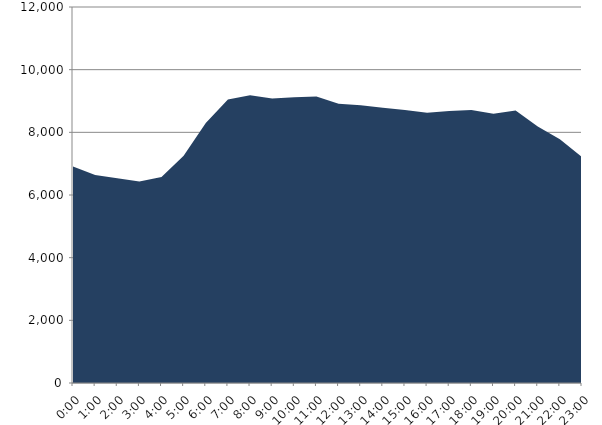
| Category | Series 0 | Series 1 |
|---|---|---|
| 2018-04-18 |  | 6907.86 |
| 2018-04-18 01:00:00 |  | 6635.71 |
| 2018-04-18 02:00:00 |  | 6532.05 |
| 2018-04-18 03:00:00 |  | 6430.26 |
| 2018-04-18 04:00:00 |  | 6574.46 |
| 2018-04-18 05:00:00 |  | 7249.93 |
| 2018-04-18 06:00:00 |  | 8294.94 |
| 2018-04-18 07:00:00 |  | 9044.09 |
| 2018-04-18 08:00:00 |  | 9185.68 |
| 2018-04-18 09:00:00 |  | 9081 |
| 2018-04-18 10:00:00 |  | 9118.44 |
| 2018-04-18 11:00:00 |  | 9143.74 |
| 2018-04-18 12:00:00 |  | 8909.53 |
| 2018-04-18 13:00:00 |  | 8863.4 |
| 2018-04-18 14:00:00 |  | 8784.83 |
| 2018-04-18 15:00:00 |  | 8714.1 |
| 2018-04-18 16:00:00 |  | 8627.04 |
| 2018-04-18 17:00:00 |  | 8677.15 |
| 2018-04-18 18:00:00 |  | 8710.59 |
| 2018-04-18 19:00:00 |  | 8593.7 |
| 2018-04-18 20:00:00 |  | 8696.13 |
| 2018-04-18 21:00:00 |  | 8187.39 |
| 2018-04-18 22:00:00 |  | 7779.07 |
| 2018-04-18 23:00:00 |  | 7213.96 |